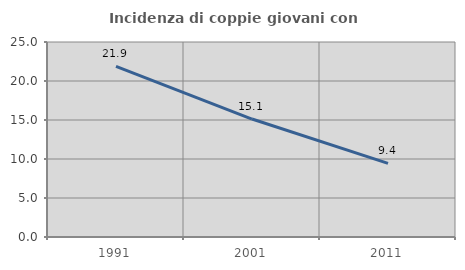
| Category | Incidenza di coppie giovani con figli |
|---|---|
| 1991.0 | 21.867 |
| 2001.0 | 15.122 |
| 2011.0 | 9.442 |